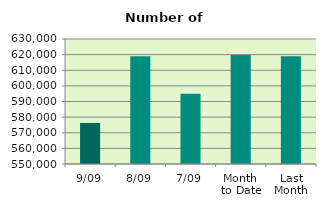
| Category | Series 0 |
|---|---|
| 9/09 | 576274 |
| 8/09 | 619008 |
| 7/09 | 594990 |
| Month 
to Date | 619778 |
| Last
Month | 618945.565 |